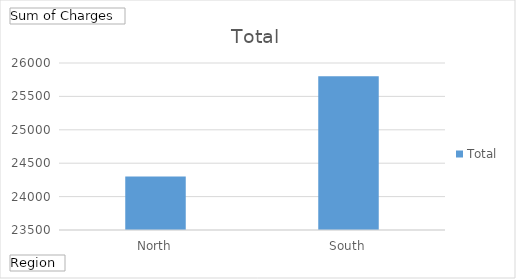
| Category | Total |
|---|---|
| North | 24300 |
| South | 25800 |